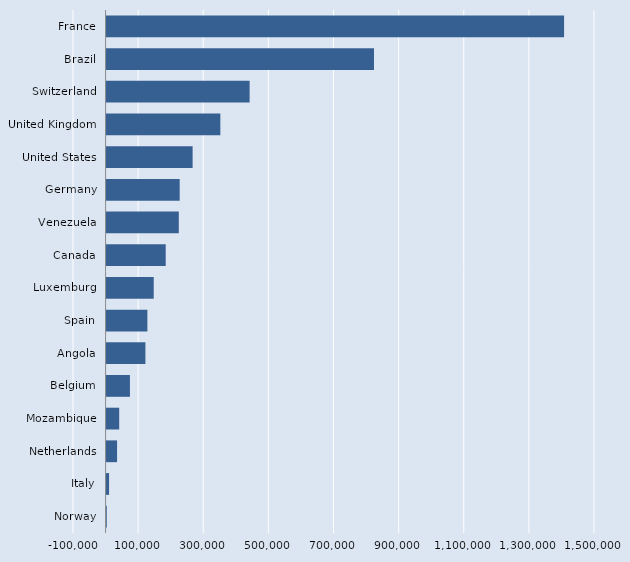
| Category | Series 0 |
|---|---|
| Norway | 609 |
| Italy | 7747 |
| Netherlands | 32280 |
| Mozambique | 38805 |
| Belgium | 71829 |
| Angola | 119326 |
| Spain | 125382 |
| Luxemburg | 144836 |
| Canada | 181645 |
| Venezuela | 221836 |
| Germany | 224573 |
| United States | 264279 |
| United Kingdom | 349427 |
| Switzerland | 439342 |
| Brazil | 821276 |
| France | 1405053 |